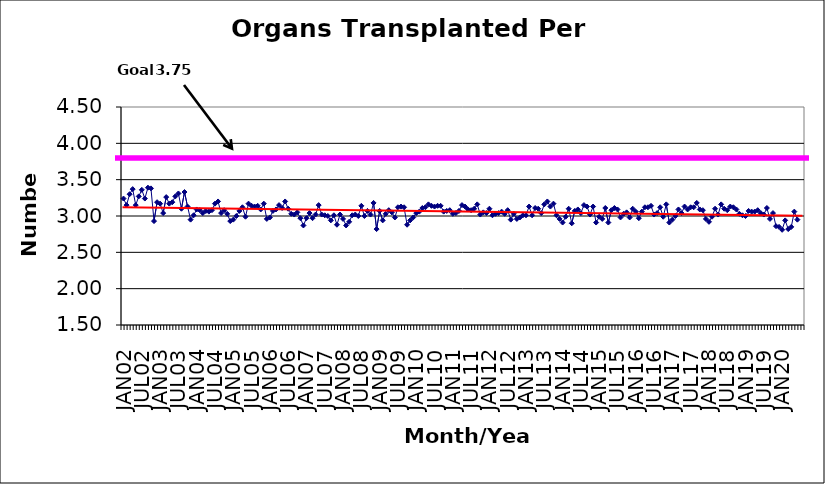
| Category | Series 0 |
|---|---|
| JAN02 | 3.24 |
| FEB02 | 3.15 |
| MAR02 | 3.3 |
| APR02 | 3.37 |
| MAY02 | 3.15 |
| JUN02 | 3.27 |
| JUL02 | 3.36 |
| AUG02 | 3.24 |
| SEP02 | 3.39 |
| OCT02 | 3.38 |
| NOV02 | 2.93 |
| DEC02 | 3.19 |
| JAN03 | 3.17 |
| FEB03 | 3.04 |
| MAR03 | 3.26 |
| APR03 | 3.17 |
| MAY03 | 3.19 |
| JUN03 | 3.27 |
| JUL03 | 3.31 |
| AUG03 | 3.1 |
| SEP03 | 3.33 |
| OCT03 | 3.13 |
| NOV03 | 2.95 |
| DEC03 | 3.01 |
| JAN04 | 3.09 |
| FEB04 | 3.08 |
| MAR04 | 3.04 |
| APR04 | 3.07 |
| MAY04 | 3.06 |
| JUN04 | 3.08 |
| JUL04 | 3.17 |
| AUG04 | 3.2 |
| SEP04 | 3.04 |
| OCT04 | 3.08 |
| NOV04 | 3.03 |
| DEC04 | 2.93 |
| JAN05 | 2.95 |
| FEB05 | 3 |
| MAR05 | 3.07 |
| APR05 | 3.12 |
| MAY05 | 2.99 |
| JUN05 | 3.17 |
| JUL05 | 3.14 |
| AUG05 | 3.13 |
| SEP05 | 3.14 |
| OCT05 | 3.09 |
| NOV05 | 3.17 |
| DEC05 | 2.96 |
| JAN06 | 2.98 |
| FEB06 | 3.07 |
| MAR06 | 3.09 |
| APR06 | 3.15 |
| MAY06 | 3.11 |
| JUN06 | 3.2 |
| JUL06 | 3.1 |
| AUG06 | 3.03 |
| SEP06 | 3.02 |
| OCT06 | 3.05 |
| NOV06 | 2.97 |
| DEC06 | 2.87 |
| JAN07 | 2.97 |
| FEB07 | 3.04 |
| MAR07 | 2.97 |
| APR07 | 3.02 |
| MAY07 | 3.15 |
| JUN07 | 3.02 |
| JUL07 | 3.01 |
| AUG07 | 3 |
| SEP07 | 2.94 |
| OCT07 | 3.01 |
| NOV07 | 2.88 |
| DEC07 | 3.02 |
| JAN08 | 2.96 |
| FEB08 | 2.87 |
| MAR08 | 2.92 |
| APR08 | 3.01 |
| MAY08 | 3.02 |
| JUN08 | 3 |
| JUL08 | 3.14 |
| AUG08 | 3 |
| SEP08 | 3.07 |
| OCT08 | 3.02 |
| NOV08 | 3.18 |
| DEC08 | 2.82 |
| JAN09 | 3.07 |
| FEB09 | 2.94 |
| MAR09 | 3.03 |
| APR09 | 3.08 |
| MAY09 | 3.05 |
| JUN09 | 2.98 |
| JUL09 | 3.12 |
| AUG09 | 3.13 |
| SEP09 | 3.12 |
| OCT09 | 2.88 |
| NOV09 | 2.94 |
| DEC09 | 2.98 |
| JAN10 | 3.04 |
| FEB10 | 3.06 |
| MAR10 | 3.11 |
| APR10 | 3.12 |
| MAY10 | 3.16 |
| JUN10 | 3.14 |
| JUL10 | 3.13 |
| AUG10 | 3.14 |
| SEP10 | 3.14 |
| OCT10 | 3.06 |
| NOV10 | 3.07 |
| DEC10 | 3.08 |
| JAN11 | 3.03 |
| FEB11 | 3.04 |
| MAR11 | 3.07 |
| APR11 | 3.15 |
| MAY11 | 3.13 |
| JUN11 | 3.09 |
| JUL11 | 3.08 |
| AUG11 | 3.1 |
| SEP11 | 3.16 |
| OCT11 | 3.02 |
| NOV11 | 3.05 |
| DEC11 | 3.04 |
| JAN12 | 3.1 |
| FEB12 | 3.01 |
| MAR12 | 3.03 |
| APR12 | 3.04 |
| MAY12 | 3.06 |
| JUN12 | 3.03 |
| JUL12 | 3.08 |
| AUG12 | 2.95 |
| SEP12 | 3.03 |
| OCT12 | 2.96 |
| NOV12 | 2.98 |
| DEC12 | 3.01 |
| JAN13 | 3.01 |
| FEB13 | 3.13 |
| MAR13 | 3.01 |
| APR13 | 3.11 |
| MAY13 | 3.1 |
| JUN13 | 3.04 |
| JUL13 | 3.16 |
| AUG13 | 3.2 |
| SEP13 | 3.13 |
| OCT13 | 3.17 |
| NOV13 | 3.01 |
| DEC13 | 2.96 |
| JAN14 | 2.91 |
| FEB14 | 2.99 |
| MAR14 | 3.1 |
| APR14 | 2.9 |
| MAY14 | 3.07 |
| JUN14 | 3.09 |
| JUL14 | 3.04 |
| AUG14 | 3.15 |
| SEP14 | 3.13 |
| OCT14 | 3.02 |
| NOV14 | 3.13 |
| DEC14 | 2.91 |
| JAN15 | 2.99 |
| FEB15 | 2.96 |
| MAR15 | 3.11 |
| APR15 | 2.91 |
| MAY15 | 3.08 |
| JUN15 | 3.11 |
| JUL15 | 3.09 |
| AUG15 | 2.98 |
| SEP15 | 3.03 |
| OCT15 | 3.05 |
| NOV15 | 2.98 |
| DEC15 | 3.1 |
| JAN16 | 3.06 |
| FEB16 | 2.97 |
| MAR16 | 3.06 |
| APR16 | 3.12 |
| MAY16 | 3.12 |
| JUN16 | 3.14 |
| JUL16 | 3.02 |
| AUG16 | 3.04 |
| SEP16 | 3.12 |
| OCT16 | 2.99 |
| NOV16 | 3.16 |
| DEC16 | 2.91 |
| JAN17 | 2.95 |
| FEB17 | 3 |
| MAR17 | 3.09 |
| APR17 | 3.04 |
| MAY17 | 3.13 |
| JUN17 | 3.09 |
| JUL17 | 3.12 |
| AUG17 | 3.12 |
| SEP17 | 3.18 |
| OCT17 | 3.09 |
| NOV17 | 3.08 |
| DEC17 | 2.96 |
| JAN18 | 2.92 |
| FEB18 | 2.99 |
| MAR18 | 3.1 |
| APR18 | 3.02 |
| MAY18 | 3.16 |
| JUN18 | 3.1 |
| JUL18 | 3.08 |
| AUG18 | 3.13 |
| SEP18 | 3.12 |
| OCT18 | 3.09 |
| NOV18 | 3.03 |
| DEC18 | 3.01 |
| JAN19 | 3 |
| FEB19 | 3.07 |
| MAR19 | 3.06 |
| APR19 | 3.06 |
| MAY19 | 3.08 |
| JUN19 | 3.04 |
| JUL19 | 3.02 |
| AUG19 | 3.11 |
| SEP19 | 2.96 |
| OCT19 | 3.04 |
| NOV19 | 2.86 |
| DEC19 | 2.85 |
| JAN20 | 2.81 |
| FEB20 | 2.94 |
| MAR20 | 2.82 |
| APR20 | 2.85 |
| MAY20 | 3.06 |
| JUN20 | 2.95 |